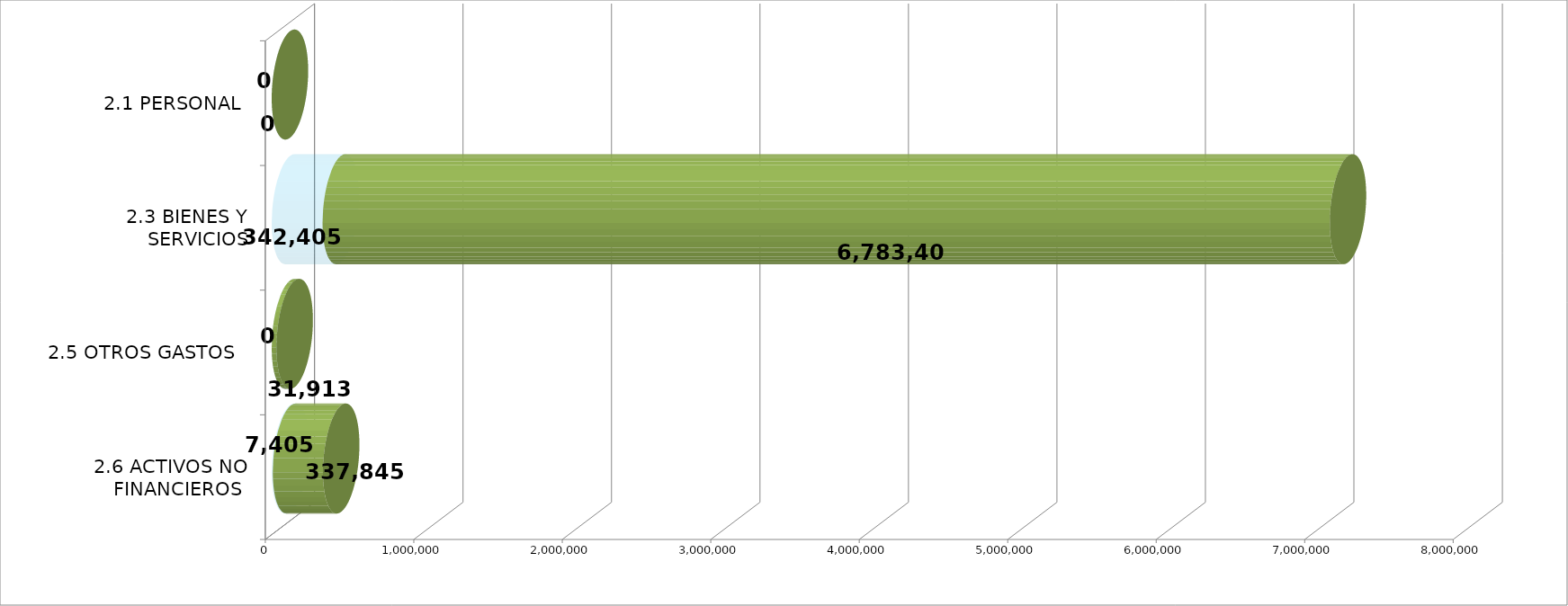
| Category | EJECUTADO | SALDO  |
|---|---|---|
| 2.1 PERSONAL | 0 | 0 |
| 2.3 BIENES Y SERVICIOS | 342405.25 | 6783406.75 |
| 2.5 OTROS GASTOS  | 0 | 31913 |
| 2.6 ACTIVOS NO FINANCIEROS  | 7404.68 | 337845.32 |